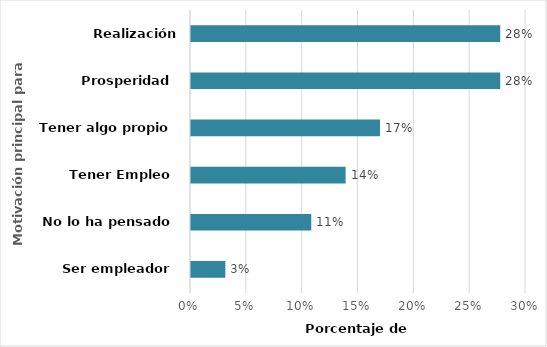
| Category | Series 0 |
|---|---|
| Ser empleador | 0.031 |
| No lo ha pensado | 0.108 |
| Tener Empleo | 0.138 |
| Tener algo propio | 0.169 |
| Prosperidad | 0.277 |
| Realización personal | 0.277 |